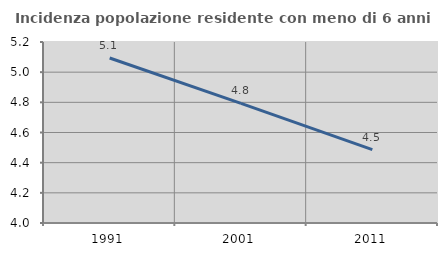
| Category | Incidenza popolazione residente con meno di 6 anni |
|---|---|
| 1991.0 | 5.094 |
| 2001.0 | 4.794 |
| 2011.0 | 4.487 |